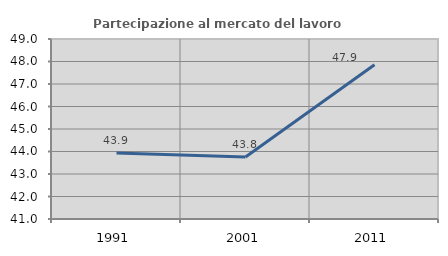
| Category | Partecipazione al mercato del lavoro  femminile |
|---|---|
| 1991.0 | 43.934 |
| 2001.0 | 43.759 |
| 2011.0 | 47.856 |